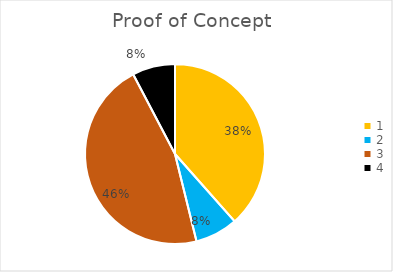
| Category | Series 0 |
|---|---|
| 0 | 0.385 |
| 1 | 0.077 |
| 2 | 0.462 |
| 3 | 0.077 |